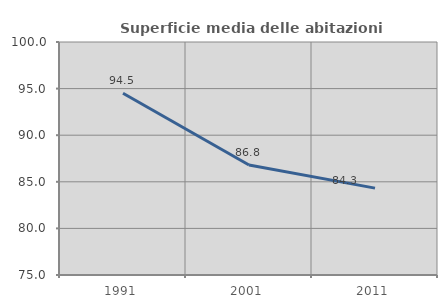
| Category | Superficie media delle abitazioni occupate |
|---|---|
| 1991.0 | 94.507 |
| 2001.0 | 86.802 |
| 2011.0 | 84.323 |